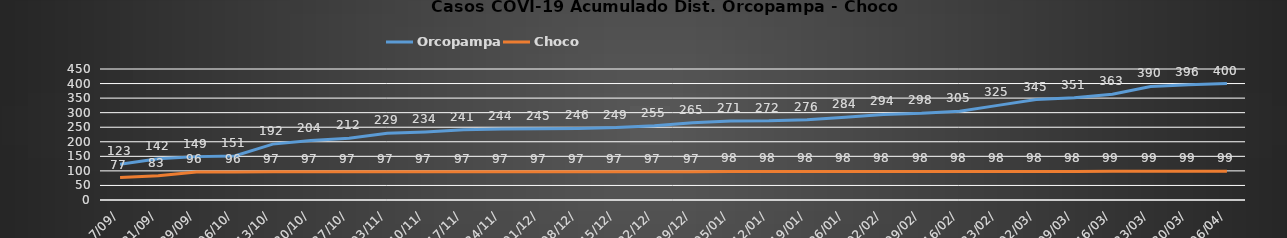
| Category | Orcopampa | Choco |
|---|---|---|
| 7/09/ | 123 | 77 |
| 21/09/ | 142 | 83 |
| 29/09/ | 149 | 96 |
| 06/10/ | 151 | 96 |
| 13/10/ | 192 | 97 |
| 20/10/ | 204 | 97 |
| 27/10/ | 212 | 97 |
| 03/11/ | 229 | 97 |
| 10/11/ | 234 | 97 |
| 17/11/ | 241 | 97 |
| 24/11/ | 244 | 97 |
| 01/12/ | 245 | 97 |
| 08/12/ | 246 | 97 |
| 15/12/ | 249 | 97 |
| 22/12/ | 255 | 97 |
| 29/12/ | 265 | 97 |
| 05/01/ | 271 | 98 |
| 12/01/ | 272 | 98 |
| 19/01/ | 276 | 98 |
| 26/01/ | 284 | 98 |
| 02/02/ | 294 | 98 |
| 09/02/ | 298 | 98 |
| 16/02/ | 305 | 98 |
| 23/02/ | 325 | 98 |
| 02/03/ | 345 | 98 |
| 09/03/ | 351 | 98 |
| 16/03/ | 363 | 99 |
| 23/03/ | 390 | 99 |
| 30/03/ | 396 | 99 |
| 06/04/ | 400 | 99 |